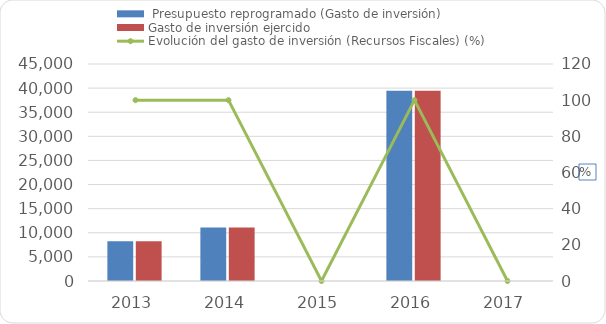
| Category |  Presupuesto reprogramado (Gasto de inversión) | Gasto de inversión ejercido |
|---|---|---|
| 2013 | 8247.4 | 8247.4 |
| 2014 | 11074.7 | 11074.7 |
| 2015 | 0 | 0 |
| 2016 | 39440.1 | 39440.1 |
| 2017 | 0 | 0 |